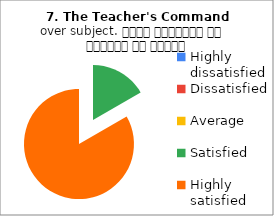
| Category | 7. The Teacher's Command over subject. विषय अवधारणा पर शिक्षक का ज्ञान |
|---|---|
| Highly dissatisfied | 0 |
| Dissatisfied | 0 |
| Average | 0 |
| Satisfied | 1 |
| Highly satisfied | 5 |